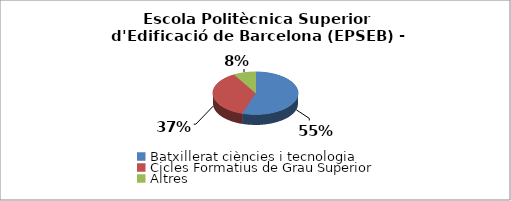
| Category | Escola Politècnica Superior d'Edificació de Barcelona (EPSEB) - Estudis cursats |
|---|---|
| Batxillerat ciències i tecnologia | 0.549 |
| Cicles Formatius de Grau Superior | 0.367 |
| Altres | 0.084 |